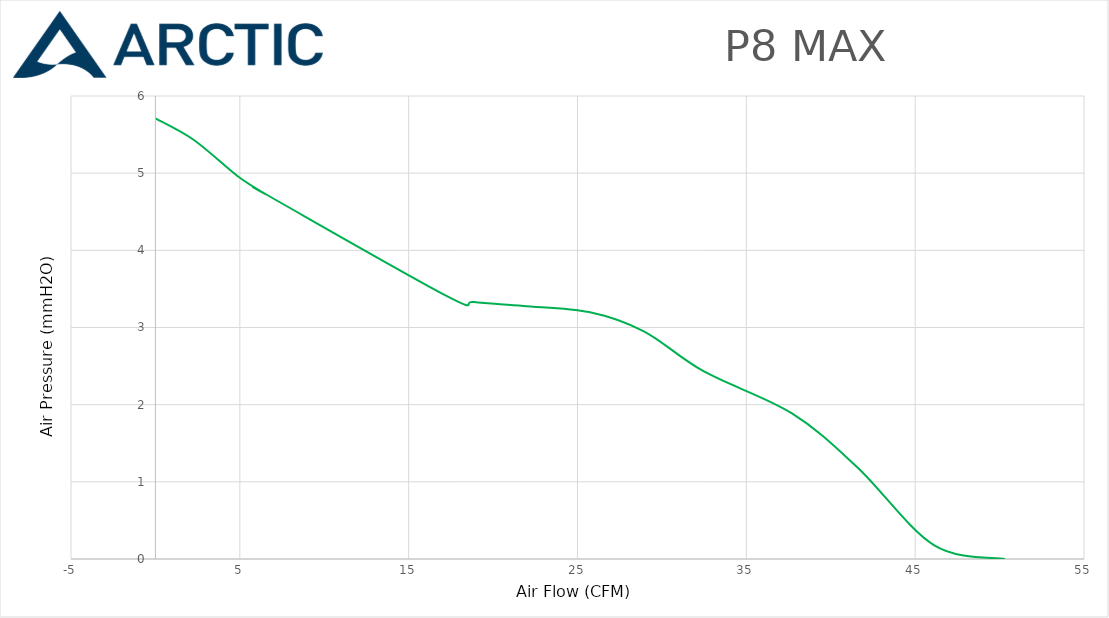
| Category | P8 MAX |
|---|---|
| 0.0 | 5.71 |
| 2.28 | 5.43 |
| 4.88 | 4.96 |
| 6.51 | 4.73 |
| 6.51 | 4.73 |
| 17.24 | 3.41 |
| 18.86 | 3.33 |
| 21.79 | 3.28 |
| 25.68 | 3.2 |
| 28.93 | 2.95 |
| 32.49 | 2.43 |
| 37.68 | 1.89 |
| 41.57 | 1.19 |
| 46.11 | 0.18 |
| 50.31 | 0 |